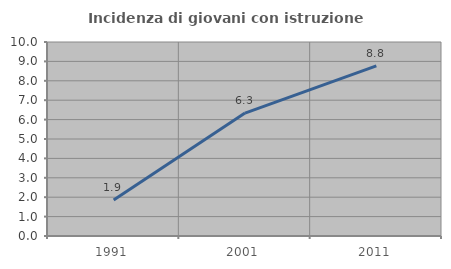
| Category | Incidenza di giovani con istruzione universitaria |
|---|---|
| 1991.0 | 1.852 |
| 2001.0 | 6.338 |
| 2011.0 | 8.766 |